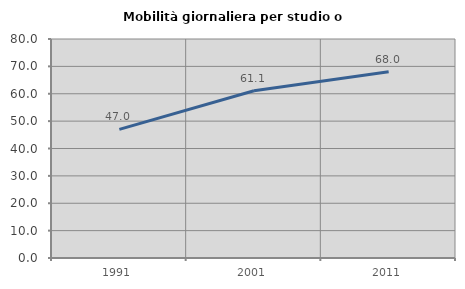
| Category | Mobilità giornaliera per studio o lavoro |
|---|---|
| 1991.0 | 46.97 |
| 2001.0 | 61.111 |
| 2011.0 | 68 |